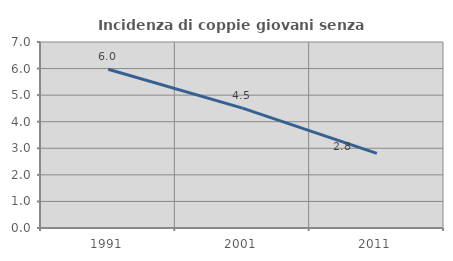
| Category | Incidenza di coppie giovani senza figli |
|---|---|
| 1991.0 | 5.975 |
| 2001.0 | 4.514 |
| 2011.0 | 2.806 |